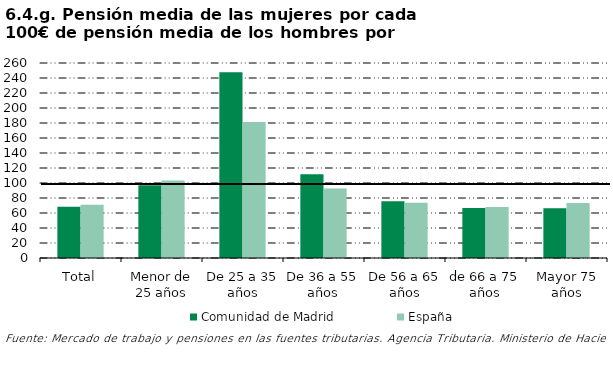
| Category | Comunidad de Madrid | España |
|---|---|---|
| Total | 68.193 | 71.152 |
| Menor de 25 años | 96.975 | 103.384 |
| De 25 a 35 años | 247.512 | 181.371 |
| De 36 a 55 años | 111.698 | 92.708 |
| De 56 a 65 años | 75.8 | 73.686 |
| de 66 a 75 años | 66.794 | 67.984 |
| Mayor 75 años | 66.441 | 73.37 |